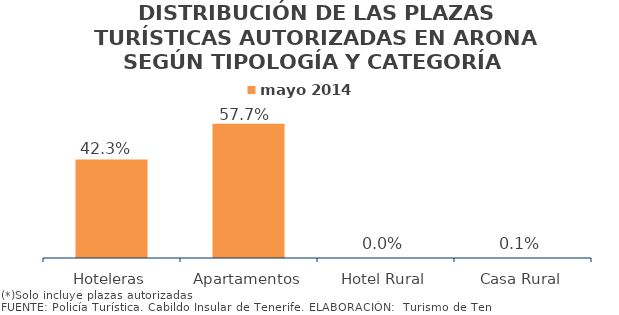
| Category | mayo 2014 |
|---|---|
| Hoteleras | 0.423 |
| Apartamentos | 0.577 |
| Hotel Rural | 0 |
| Casa Rural | 0.001 |